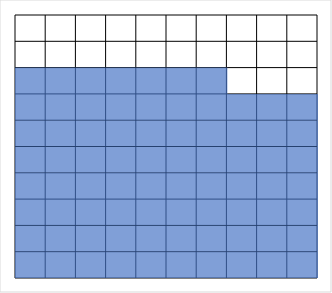
| Category | Series 0 |
|---|---|
| 0 | 10 |
| 1 | 10 |
| 2 | 10 |
| 3 | 10 |
| 4 | 10 |
| 5 | 10 |
| 6 | 10 |
| 7 | 7 |
| 8 | 0 |
| 9 | 0 |